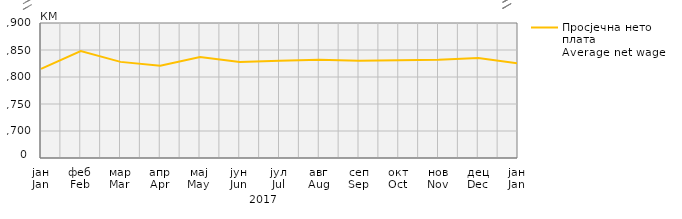
| Category | Просјечна нето плата
Average net wage |
|---|---|
| јан
Jan | 815 |
| феб
Feb | 848 |
| мар
Mar | 828 |
| апр
Apr | 821 |
| мај
May | 837 |
| јун
Jun | 828 |
| јул
Jul | 830 |
| авг
Aug | 832 |
| сеп
Sep | 830 |
| окт
Oct | 831 |
| нов
Nov | 832 |
| дец
Dec | 835 |
| јан
Jan | 825 |